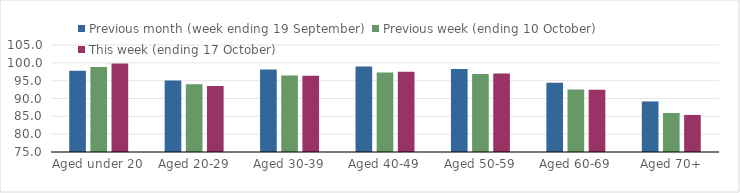
| Category | Previous month (week ending 19 September) | Previous week (ending 10 October) | This week (ending 17 October) |
|---|---|---|---|
| Aged under 20 | 97.78 | 98.81 | 99.81 |
| Aged 20-29 | 95.04 | 94.03 | 93.49 |
| Aged 30-39 | 98.15 | 96.46 | 96.36 |
| Aged 40-49 | 98.99 | 97.28 | 97.53 |
| Aged 50-59 | 98.28 | 96.84 | 97.02 |
| Aged 60-69 | 94.4 | 92.53 | 92.47 |
| Aged 70+ | 89.18 | 85.94 | 85.39 |